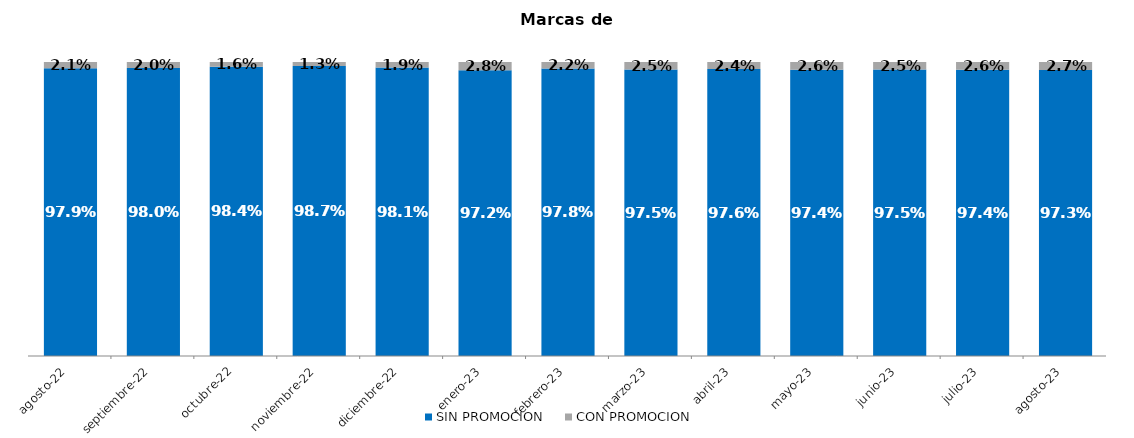
| Category | SIN PROMOCION   | CON PROMOCION   |
|---|---|---|
| 2022-08-01 | 0.979 | 0.021 |
| 2022-09-01 | 0.98 | 0.02 |
| 2022-10-01 | 0.984 | 0.016 |
| 2022-11-01 | 0.987 | 0.013 |
| 2022-12-01 | 0.981 | 0.019 |
| 2023-01-01 | 0.972 | 0.028 |
| 2023-02-01 | 0.978 | 0.022 |
| 2023-03-01 | 0.975 | 0.025 |
| 2023-04-01 | 0.976 | 0.024 |
| 2023-05-01 | 0.974 | 0.026 |
| 2023-06-01 | 0.975 | 0.025 |
| 2023-07-01 | 0.974 | 0.026 |
| 2023-08-01 | 0.973 | 0.027 |